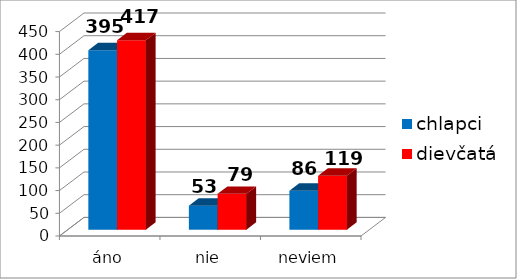
| Category | chlapci | dievčatá |
|---|---|---|
| áno | 395 | 417 |
| nie | 53 | 79 |
| neviem | 86 | 119 |